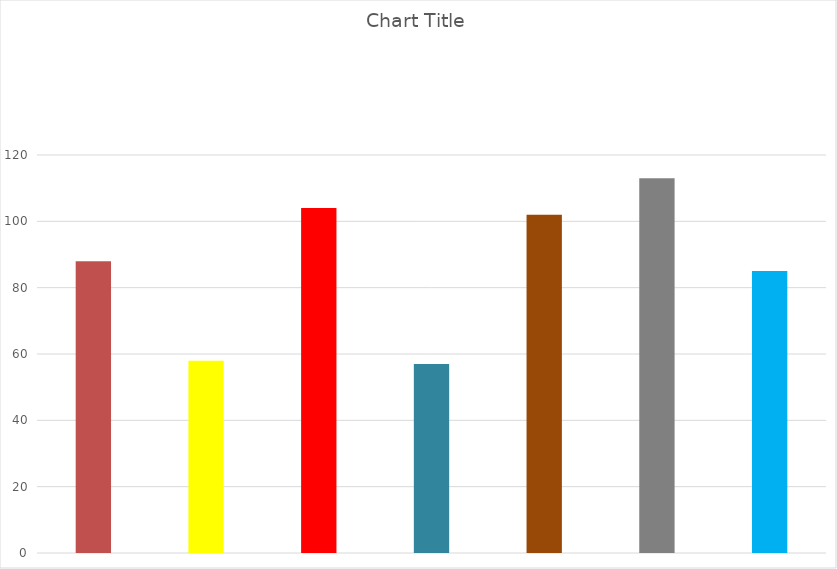
| Category | Series 0 |
|---|---|
| 0 | 88 |
| 1 | 58 |
| 2 | 104 |
| 3 | 57 |
| 4 | 102 |
| 5 | 113 |
| 6 | 85 |